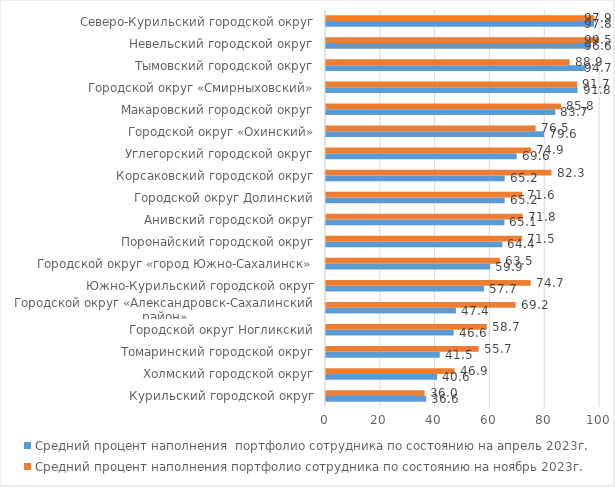
| Category | Средний процент наполнения  портфолио сотрудника по состоянию на апрель 2023г. | Средний процент наполнения портфолио сотрудника по состоянию на ноябрь 2023г. |
|---|---|---|
| Курильский городской округ | 36.6 | 36 |
| Холмский городской округ | 40.6 | 46.9 |
| Томаринский городской округ | 41.5 | 55.7 |
| Городской округ Ногликский | 46.6 | 58.7 |
| Городской округ «Александровск-Сахалинский район» | 47.4 | 69.2 |
| Южно-Курильский городской округ | 57.7 | 74.7 |
| Городской округ «город Южно-Сахалинск» | 59.9 | 63.5 |
| Поронайский городской округ | 64.4 | 71.5 |
| Анивский городской округ | 65.1 | 71.8 |
| Городской округ Долинский | 65.2 | 71.6 |
| Корсаковский городской округ | 65.2 | 82.3 |
| Углегорский городской округ | 69.6 | 74.9 |
| Городской округ «Охинский» | 79.6 | 76.5 |
| Макаровский городской округ | 83.7 | 85.8 |
| Городской округ «Смирныховский» | 91.8 | 91.7 |
| Тымовский городской округ | 94.7 | 88.9 |
| Невельский городской округ | 96.6 | 99.5 |
| Северо-Курильский городской округ | 97.8 | 97.9 |